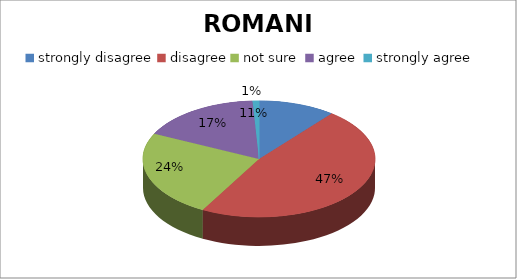
| Category | ROMANIA |
|---|---|
| strongly disagree | 12 |
| disagree | 53 |
| not sure  | 27 |
| agree  | 19 |
| strongly agree | 1 |